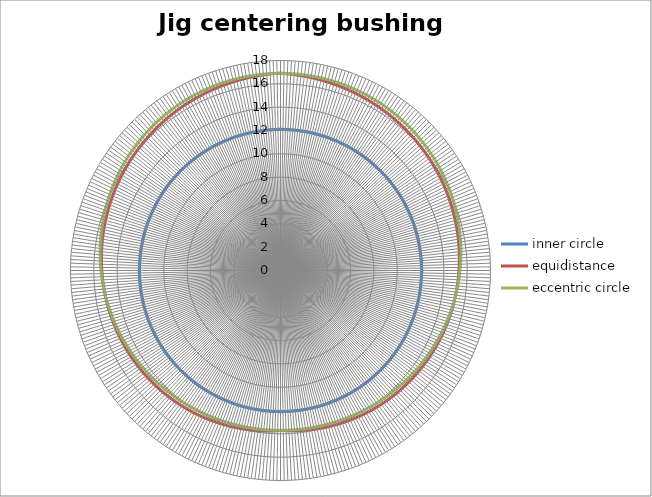
| Category | inner circle | equidistance | eccentric circle |
|---|---|---|---|
| 0 | 12.1 | 16.9 | 16.9 |
| 1 | 12.1 | 16.882 | 16.9 |
| 2 | 12.1 | 16.864 | 16.899 |
| 3 | 12.1 | 16.847 | 16.898 |
| 4 | 12.1 | 16.829 | 16.896 |
| 5 | 12.1 | 16.811 | 16.894 |
| 6 | 12.1 | 16.793 | 16.892 |
| 7 | 12.1 | 16.776 | 16.889 |
| 8 | 12.1 | 16.758 | 16.886 |
| 9 | 12.1 | 16.74 | 16.882 |
| 10 | 12.1 | 16.722 | 16.878 |
| 11 | 12.1 | 16.704 | 16.873 |
| 12 | 12.1 | 16.687 | 16.868 |
| 13 | 12.1 | 16.669 | 16.863 |
| 14 | 12.1 | 16.651 | 16.857 |
| 15 | 12.1 | 16.633 | 16.851 |
| 16 | 12.1 | 16.616 | 16.844 |
| 17 | 12.1 | 16.598 | 16.837 |
| 18 | 12.1 | 16.58 | 16.829 |
| 19 | 12.1 | 16.562 | 16.821 |
| 20 | 12.1 | 16.544 | 16.812 |
| 21 | 12.1 | 16.527 | 16.804 |
| 22 | 12.1 | 16.509 | 16.794 |
| 23 | 12.1 | 16.491 | 16.784 |
| 24 | 12.1 | 16.473 | 16.774 |
| 25 | 12.1 | 16.456 | 16.764 |
| 26 | 12.1 | 16.438 | 16.753 |
| 27 | 12.1 | 16.42 | 16.741 |
| 28 | 12.1 | 16.402 | 16.73 |
| 29 | 12.1 | 16.384 | 16.717 |
| 30 | 12.1 | 16.367 | 16.705 |
| 31 | 12.1 | 16.349 | 16.692 |
| 32 | 12.1 | 16.331 | 16.678 |
| 33 | 12.1 | 16.313 | 16.665 |
| 34 | 12.1 | 16.296 | 16.651 |
| 35 | 12.1 | 16.278 | 16.636 |
| 36 | 12.1 | 16.26 | 16.621 |
| 37 | 12.1 | 16.242 | 16.606 |
| 38 | 12.1 | 16.224 | 16.59 |
| 39 | 12.1 | 16.207 | 16.574 |
| 40 | 12.1 | 16.189 | 16.558 |
| 41 | 12.1 | 16.171 | 16.541 |
| 42 | 12.1 | 16.153 | 16.524 |
| 43 | 12.1 | 16.136 | 16.506 |
| 44 | 12.1 | 16.118 | 16.488 |
| 45 | 12.1 | 16.1 | 16.47 |
| 46 | 12.1 | 16.082 | 16.452 |
| 47 | 12.1 | 16.064 | 16.433 |
| 48 | 12.1 | 16.047 | 16.414 |
| 49 | 12.1 | 16.029 | 16.394 |
| 50 | 12.1 | 16.011 | 16.374 |
| 51 | 12.1 | 15.993 | 16.354 |
| 52 | 12.1 | 15.976 | 16.334 |
| 53 | 12.1 | 15.958 | 16.313 |
| 54 | 12.1 | 15.94 | 16.292 |
| 55 | 12.1 | 15.922 | 16.271 |
| 56 | 12.1 | 15.904 | 16.249 |
| 57 | 12.1 | 15.887 | 16.227 |
| 58 | 12.1 | 15.869 | 16.205 |
| 59 | 12.1 | 15.851 | 16.182 |
| 60 | 12.1 | 15.833 | 16.16 |
| 61 | 12.1 | 15.816 | 16.136 |
| 62 | 12.1 | 15.798 | 16.113 |
| 63 | 12.1 | 15.78 | 16.09 |
| 64 | 12.1 | 15.762 | 16.066 |
| 65 | 12.1 | 15.744 | 16.042 |
| 66 | 12.1 | 15.727 | 16.018 |
| 67 | 12.1 | 15.709 | 15.993 |
| 68 | 12.1 | 15.691 | 15.968 |
| 69 | 12.1 | 15.673 | 15.944 |
| 70 | 12.1 | 15.656 | 15.918 |
| 71 | 12.1 | 15.638 | 15.893 |
| 72 | 12.1 | 15.62 | 15.868 |
| 73 | 12.1 | 15.602 | 15.842 |
| 74 | 12.1 | 15.584 | 15.816 |
| 75 | 12.1 | 15.567 | 15.79 |
| 76 | 12.1 | 15.549 | 15.764 |
| 77 | 12.1 | 15.531 | 15.737 |
| 78 | 12.1 | 15.513 | 15.711 |
| 79 | 12.1 | 15.496 | 15.684 |
| 80 | 12.1 | 15.478 | 15.657 |
| 81 | 12.1 | 15.46 | 15.63 |
| 82 | 12.1 | 15.442 | 15.603 |
| 83 | 12.1 | 15.424 | 15.576 |
| 84 | 12.1 | 15.407 | 15.549 |
| 85 | 12.1 | 15.389 | 15.522 |
| 86 | 12.1 | 15.371 | 15.494 |
| 87 | 12.1 | 15.353 | 15.466 |
| 88 | 12.1 | 15.336 | 15.439 |
| 89 | 12.1 | 15.318 | 15.411 |
| 90 | 12.1 | 15.3 | 15.383 |
| 91 | 12.1 | 15.282 | 15.356 |
| 92 | 12.1 | 15.264 | 15.328 |
| 93 | 12.1 | 15.247 | 15.3 |
| 94 | 12.1 | 15.229 | 15.272 |
| 95 | 12.1 | 15.211 | 15.244 |
| 96 | 12.1 | 15.193 | 15.216 |
| 97 | 12.1 | 15.176 | 15.188 |
| 98 | 12.1 | 15.158 | 15.16 |
| 99 | 12.1 | 15.14 | 15.132 |
| 100 | 12.1 | 15.122 | 15.105 |
| 101 | 12.1 | 15.104 | 15.077 |
| 102 | 12.1 | 15.087 | 15.049 |
| 103 | 12.1 | 15.069 | 15.021 |
| 104 | 12.1 | 15.051 | 14.994 |
| 105 | 12.1 | 15.033 | 14.966 |
| 106 | 12.1 | 15.016 | 14.938 |
| 107 | 12.1 | 14.998 | 14.911 |
| 108 | 12.1 | 14.98 | 14.884 |
| 109 | 12.1 | 14.962 | 14.856 |
| 110 | 12.1 | 14.944 | 14.829 |
| 111 | 12.1 | 14.927 | 14.802 |
| 112 | 12.1 | 14.909 | 14.775 |
| 113 | 12.1 | 14.891 | 14.749 |
| 114 | 12.1 | 14.873 | 14.722 |
| 115 | 12.1 | 14.856 | 14.696 |
| 116 | 12.1 | 14.838 | 14.669 |
| 117 | 12.1 | 14.82 | 14.643 |
| 118 | 12.1 | 14.802 | 14.617 |
| 119 | 12.1 | 14.784 | 14.592 |
| 120 | 12.1 | 14.767 | 14.566 |
| 121 | 12.1 | 14.749 | 14.541 |
| 122 | 12.1 | 14.731 | 14.516 |
| 123 | 12.1 | 14.713 | 14.491 |
| 124 | 12.1 | 14.696 | 14.466 |
| 125 | 12.1 | 14.678 | 14.442 |
| 126 | 12.1 | 14.66 | 14.418 |
| 127 | 12.1 | 14.642 | 14.394 |
| 128 | 12.1 | 14.624 | 14.37 |
| 129 | 12.1 | 14.607 | 14.347 |
| 130 | 12.1 | 14.589 | 14.324 |
| 131 | 12.1 | 14.571 | 14.301 |
| 132 | 12.1 | 14.553 | 14.279 |
| 133 | 12.1 | 14.536 | 14.257 |
| 134 | 12.1 | 14.518 | 14.235 |
| 135 | 12.1 | 14.5 | 14.214 |
| 136 | 12.1 | 14.482 | 14.193 |
| 137 | 12.1 | 14.464 | 14.172 |
| 138 | 12.1 | 14.447 | 14.152 |
| 139 | 12.1 | 14.429 | 14.132 |
| 140 | 12.1 | 14.411 | 14.112 |
| 141 | 12.1 | 14.393 | 14.093 |
| 142 | 12.1 | 14.376 | 14.074 |
| 143 | 12.1 | 14.358 | 14.055 |
| 144 | 12.1 | 14.34 | 14.037 |
| 145 | 12.1 | 14.322 | 14.019 |
| 146 | 12.1 | 14.304 | 14.002 |
| 147 | 12.1 | 14.287 | 13.985 |
| 148 | 12.1 | 14.269 | 13.969 |
| 149 | 12.1 | 14.251 | 13.953 |
| 150 | 12.1 | 14.233 | 13.937 |
| 151 | 12.1 | 14.216 | 13.922 |
| 152 | 12.1 | 14.198 | 13.908 |
| 153 | 12.1 | 14.18 | 13.893 |
| 154 | 12.1 | 14.162 | 13.88 |
| 155 | 12.1 | 14.144 | 13.866 |
| 156 | 12.1 | 14.127 | 13.854 |
| 157 | 12.1 | 14.109 | 13.841 |
| 158 | 12.1 | 14.091 | 13.83 |
| 159 | 12.1 | 14.073 | 13.818 |
| 160 | 12.1 | 14.056 | 13.807 |
| 161 | 12.1 | 14.038 | 13.797 |
| 162 | 12.1 | 14.02 | 13.787 |
| 163 | 12.1 | 14.002 | 13.778 |
| 164 | 12.1 | 13.984 | 13.769 |
| 165 | 12.1 | 13.967 | 13.761 |
| 166 | 12.1 | 13.949 | 13.753 |
| 167 | 12.1 | 13.931 | 13.746 |
| 168 | 12.1 | 13.913 | 13.739 |
| 169 | 12.1 | 13.896 | 13.733 |
| 170 | 12.1 | 13.878 | 13.727 |
| 171 | 12.1 | 13.86 | 13.722 |
| 172 | 12.1 | 13.842 | 13.717 |
| 173 | 12.1 | 13.824 | 13.713 |
| 174 | 12.1 | 13.807 | 13.71 |
| 175 | 12.1 | 13.789 | 13.707 |
| 176 | 12.1 | 13.771 | 13.704 |
| 177 | 12.1 | 13.753 | 13.702 |
| 178 | 12.1 | 13.736 | 13.701 |
| 179 | 12.1 | 13.718 | 13.7 |
| 180 | 12.1 | 13.718 | 13.7 |
| 181 | 12.1 | 13.736 | 13.7 |
| 182 | 12.1 | 13.753 | 13.701 |
| 183 | 12.1 | 13.771 | 13.702 |
| 184 | 12.1 | 13.789 | 13.704 |
| 185 | 12.1 | 13.807 | 13.707 |
| 186 | 12.1 | 13.824 | 13.71 |
| 187 | 12.1 | 13.842 | 13.713 |
| 188 | 12.1 | 13.86 | 13.717 |
| 189 | 12.1 | 13.878 | 13.722 |
| 190 | 12.1 | 13.896 | 13.727 |
| 191 | 12.1 | 13.913 | 13.733 |
| 192 | 12.1 | 13.931 | 13.739 |
| 193 | 12.1 | 13.949 | 13.746 |
| 194 | 12.1 | 13.967 | 13.753 |
| 195 | 12.1 | 13.984 | 13.761 |
| 196 | 12.1 | 14.002 | 13.769 |
| 197 | 12.1 | 14.02 | 13.778 |
| 198 | 12.1 | 14.038 | 13.787 |
| 199 | 12.1 | 14.056 | 13.797 |
| 200 | 12.1 | 14.073 | 13.807 |
| 201 | 12.1 | 14.091 | 13.818 |
| 202 | 12.1 | 14.109 | 13.83 |
| 203 | 12.1 | 14.127 | 13.841 |
| 204 | 12.1 | 14.144 | 13.854 |
| 205 | 12.1 | 14.162 | 13.866 |
| 206 | 12.1 | 14.18 | 13.88 |
| 207 | 12.1 | 14.198 | 13.893 |
| 208 | 12.1 | 14.216 | 13.908 |
| 209 | 12.1 | 14.233 | 13.922 |
| 210 | 12.1 | 14.251 | 13.937 |
| 211 | 12.1 | 14.269 | 13.953 |
| 212 | 12.1 | 14.287 | 13.969 |
| 213 | 12.1 | 14.304 | 13.985 |
| 214 | 12.1 | 14.322 | 14.002 |
| 215 | 12.1 | 14.34 | 14.019 |
| 216 | 12.1 | 14.358 | 14.037 |
| 217 | 12.1 | 14.376 | 14.055 |
| 218 | 12.1 | 14.393 | 14.074 |
| 219 | 12.1 | 14.411 | 14.093 |
| 220 | 12.1 | 14.429 | 14.112 |
| 221 | 12.1 | 14.447 | 14.132 |
| 222 | 12.1 | 14.464 | 14.152 |
| 223 | 12.1 | 14.482 | 14.172 |
| 224 | 12.1 | 14.5 | 14.193 |
| 225 | 12.1 | 14.518 | 14.214 |
| 226 | 12.1 | 14.536 | 14.235 |
| 227 | 12.1 | 14.553 | 14.257 |
| 228 | 12.1 | 14.571 | 14.279 |
| 229 | 12.1 | 14.589 | 14.301 |
| 230 | 12.1 | 14.607 | 14.324 |
| 231 | 12.1 | 14.624 | 14.347 |
| 232 | 12.1 | 14.642 | 14.37 |
| 233 | 12.1 | 14.66 | 14.394 |
| 234 | 12.1 | 14.678 | 14.418 |
| 235 | 12.1 | 14.696 | 14.442 |
| 236 | 12.1 | 14.713 | 14.466 |
| 237 | 12.1 | 14.731 | 14.491 |
| 238 | 12.1 | 14.749 | 14.516 |
| 239 | 12.1 | 14.767 | 14.541 |
| 240 | 12.1 | 14.784 | 14.566 |
| 241 | 12.1 | 14.802 | 14.592 |
| 242 | 12.1 | 14.82 | 14.617 |
| 243 | 12.1 | 14.838 | 14.643 |
| 244 | 12.1 | 14.856 | 14.669 |
| 245 | 12.1 | 14.873 | 14.696 |
| 246 | 12.1 | 14.891 | 14.722 |
| 247 | 12.1 | 14.909 | 14.749 |
| 248 | 12.1 | 14.927 | 14.775 |
| 249 | 12.1 | 14.944 | 14.802 |
| 250 | 12.1 | 14.962 | 14.829 |
| 251 | 12.1 | 14.98 | 14.856 |
| 252 | 12.1 | 14.998 | 14.884 |
| 253 | 12.1 | 15.016 | 14.911 |
| 254 | 12.1 | 15.033 | 14.938 |
| 255 | 12.1 | 15.051 | 14.966 |
| 256 | 12.1 | 15.069 | 14.994 |
| 257 | 12.1 | 15.087 | 15.021 |
| 258 | 12.1 | 15.104 | 15.049 |
| 259 | 12.1 | 15.122 | 15.077 |
| 260 | 12.1 | 15.14 | 15.105 |
| 261 | 12.1 | 15.158 | 15.132 |
| 262 | 12.1 | 15.176 | 15.16 |
| 263 | 12.1 | 15.193 | 15.188 |
| 264 | 12.1 | 15.211 | 15.216 |
| 265 | 12.1 | 15.229 | 15.244 |
| 266 | 12.1 | 15.247 | 15.272 |
| 267 | 12.1 | 15.264 | 15.3 |
| 268 | 12.1 | 15.282 | 15.328 |
| 269 | 12.1 | 15.3 | 15.356 |
| 270 | 12.1 | 15.318 | 15.383 |
| 271 | 12.1 | 15.336 | 15.411 |
| 272 | 12.1 | 15.353 | 15.439 |
| 273 | 12.1 | 15.371 | 15.466 |
| 274 | 12.1 | 15.389 | 15.494 |
| 275 | 12.1 | 15.407 | 15.522 |
| 276 | 12.1 | 15.424 | 15.549 |
| 277 | 12.1 | 15.442 | 15.576 |
| 278 | 12.1 | 15.46 | 15.603 |
| 279 | 12.1 | 15.478 | 15.63 |
| 280 | 12.1 | 15.496 | 15.657 |
| 281 | 12.1 | 15.513 | 15.684 |
| 282 | 12.1 | 15.531 | 15.711 |
| 283 | 12.1 | 15.549 | 15.737 |
| 284 | 12.1 | 15.567 | 15.764 |
| 285 | 12.1 | 15.584 | 15.79 |
| 286 | 12.1 | 15.602 | 15.816 |
| 287 | 12.1 | 15.62 | 15.842 |
| 288 | 12.1 | 15.638 | 15.868 |
| 289 | 12.1 | 15.656 | 15.893 |
| 290 | 12.1 | 15.673 | 15.918 |
| 291 | 12.1 | 15.691 | 15.944 |
| 292 | 12.1 | 15.709 | 15.968 |
| 293 | 12.1 | 15.727 | 15.993 |
| 294 | 12.1 | 15.744 | 16.018 |
| 295 | 12.1 | 15.762 | 16.042 |
| 296 | 12.1 | 15.78 | 16.066 |
| 297 | 12.1 | 15.798 | 16.09 |
| 298 | 12.1 | 15.816 | 16.113 |
| 299 | 12.1 | 15.833 | 16.136 |
| 300 | 12.1 | 15.851 | 16.16 |
| 301 | 12.1 | 15.869 | 16.182 |
| 302 | 12.1 | 15.887 | 16.205 |
| 303 | 12.1 | 15.904 | 16.227 |
| 304 | 12.1 | 15.922 | 16.249 |
| 305 | 12.1 | 15.94 | 16.271 |
| 306 | 12.1 | 15.958 | 16.292 |
| 307 | 12.1 | 15.976 | 16.313 |
| 308 | 12.1 | 15.993 | 16.334 |
| 309 | 12.1 | 16.011 | 16.354 |
| 310 | 12.1 | 16.029 | 16.374 |
| 311 | 12.1 | 16.047 | 16.394 |
| 312 | 12.1 | 16.064 | 16.414 |
| 313 | 12.1 | 16.082 | 16.433 |
| 314 | 12.1 | 16.1 | 16.452 |
| 315 | 12.1 | 16.118 | 16.47 |
| 316 | 12.1 | 16.136 | 16.488 |
| 317 | 12.1 | 16.153 | 16.506 |
| 318 | 12.1 | 16.171 | 16.524 |
| 319 | 12.1 | 16.189 | 16.541 |
| 320 | 12.1 | 16.207 | 16.558 |
| 321 | 12.1 | 16.224 | 16.574 |
| 322 | 12.1 | 16.242 | 16.59 |
| 323 | 12.1 | 16.26 | 16.606 |
| 324 | 12.1 | 16.278 | 16.621 |
| 325 | 12.1 | 16.296 | 16.636 |
| 326 | 12.1 | 16.313 | 16.651 |
| 327 | 12.1 | 16.331 | 16.665 |
| 328 | 12.1 | 16.349 | 16.678 |
| 329 | 12.1 | 16.367 | 16.692 |
| 330 | 12.1 | 16.384 | 16.705 |
| 331 | 12.1 | 16.402 | 16.717 |
| 332 | 12.1 | 16.42 | 16.73 |
| 333 | 12.1 | 16.438 | 16.741 |
| 334 | 12.1 | 16.456 | 16.753 |
| 335 | 12.1 | 16.473 | 16.764 |
| 336 | 12.1 | 16.491 | 16.774 |
| 337 | 12.1 | 16.509 | 16.784 |
| 338 | 12.1 | 16.527 | 16.794 |
| 339 | 12.1 | 16.544 | 16.804 |
| 340 | 12.1 | 16.562 | 16.812 |
| 341 | 12.1 | 16.58 | 16.821 |
| 342 | 12.1 | 16.598 | 16.829 |
| 343 | 12.1 | 16.616 | 16.837 |
| 344 | 12.1 | 16.633 | 16.844 |
| 345 | 12.1 | 16.651 | 16.851 |
| 346 | 12.1 | 16.669 | 16.857 |
| 347 | 12.1 | 16.687 | 16.863 |
| 348 | 12.1 | 16.704 | 16.868 |
| 349 | 12.1 | 16.722 | 16.873 |
| 350 | 12.1 | 16.74 | 16.878 |
| 351 | 12.1 | 16.758 | 16.882 |
| 352 | 12.1 | 16.776 | 16.886 |
| 353 | 12.1 | 16.793 | 16.889 |
| 354 | 12.1 | 16.811 | 16.892 |
| 355 | 12.1 | 16.829 | 16.894 |
| 356 | 12.1 | 16.847 | 16.896 |
| 357 | 12.1 | 16.864 | 16.898 |
| 358 | 12.1 | 16.882 | 16.899 |
| 359 | 12.1 | 16.9 | 16.9 |